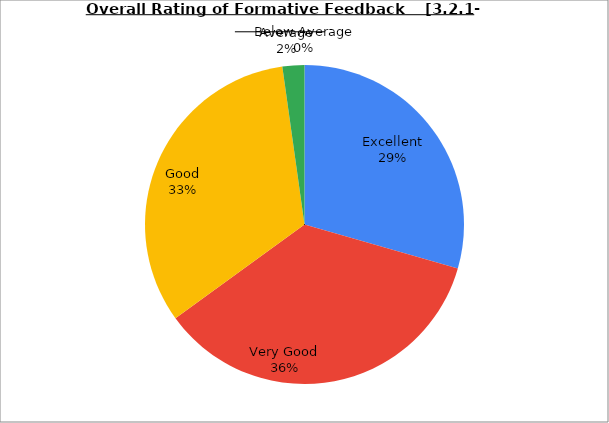
| Category | Series 0 |
|---|---|
| Excellent | 29.444 |
| Very Good | 35.556 |
| Good | 32.778 |
| Average | 2.222 |
| Below Average | 0 |